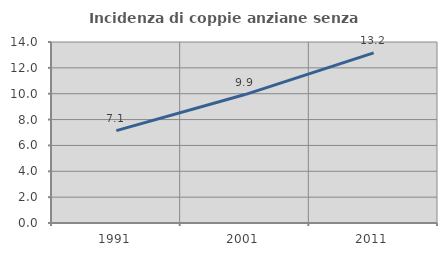
| Category | Incidenza di coppie anziane senza figli  |
|---|---|
| 1991.0 | 7.143 |
| 2001.0 | 9.935 |
| 2011.0 | 13.162 |